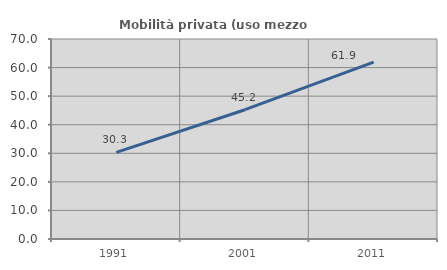
| Category | Mobilità privata (uso mezzo privato) |
|---|---|
| 1991.0 | 30.328 |
| 2001.0 | 45.249 |
| 2011.0 | 61.905 |